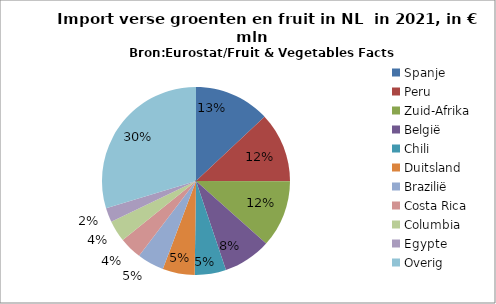
| Category | 2021R |
|---|---|
| Spanje | 1200 |
| Peru | 1111 |
| Zuid-Afrika | 1068 |
| België | 761 |
| Chili | 497 |
| Duitsland | 509 |
| Brazilië | 426 |
| Costa Rica | 357 |
| Columbia | 338 |
| Egypte | 224 |
| Overig | 2741 |